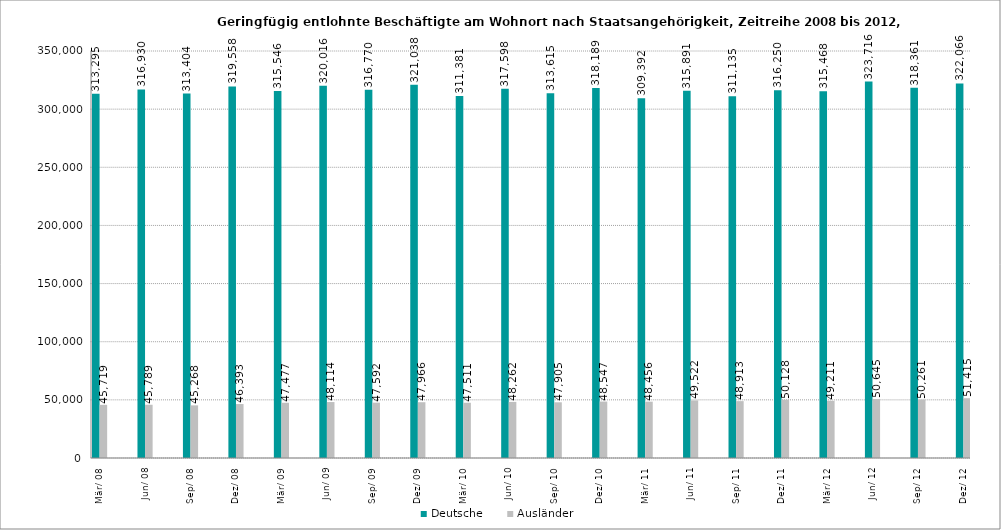
| Category | Deutsche | Ausländer |
|---|---|---|
| 2008-03-31 | 313295 | 45719 |
| 2008-06-30 | 316930 | 45789 |
| 2008-09-30 | 313404 | 45268 |
| 2008-12-31 | 319558 | 46393 |
| 2009-03-31 | 315546 | 47477 |
| 2009-06-30 | 320016 | 48114 |
| 2009-09-30 | 316770 | 47592 |
| 2009-12-31 | 321038 | 47966 |
| 2010-03-31 | 311381 | 47511 |
| 2010-06-30 | 317598 | 48262 |
| 2010-09-30 | 313615 | 47905 |
| 2010-12-31 | 318189 | 48547 |
| 2011-03-31 | 309392 | 48456 |
| 2011-06-30 | 315891 | 49522 |
| 2011-09-30 | 311135 | 48913 |
| 2011-12-31 | 316250 | 50128 |
| 2012-03-31 | 315468 | 49211 |
| 2012-06-30 | 323716 | 50645 |
| 2012-09-30 | 318361 | 50261 |
| 2012-12-31 | 322066 | 51415 |